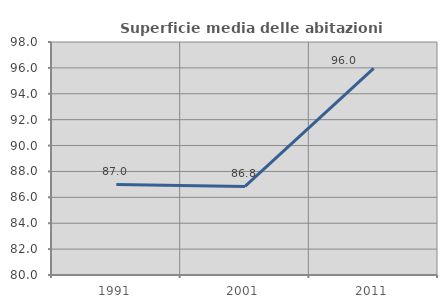
| Category | Superficie media delle abitazioni occupate |
|---|---|
| 1991.0 | 87.001 |
| 2001.0 | 86.843 |
| 2011.0 | 95.969 |